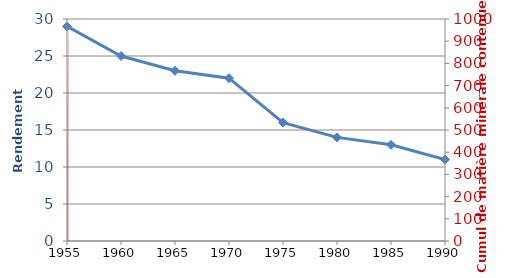
| Category | Cumul de matière minérale exportée |
|---|---|
| 0 | 184.15 |
| 1 | 342.9 |
| 2 | 488.95 |
| 3 | 628.65 |
| 4 | 730.25 |
| 5 | 819.15 |
| 6 | 901.7 |
| 7 | 971.55 |